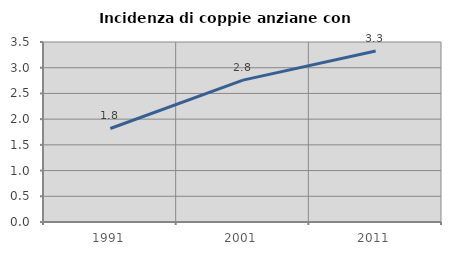
| Category | Incidenza di coppie anziane con figli |
|---|---|
| 1991.0 | 1.818 |
| 2001.0 | 2.759 |
| 2011.0 | 3.325 |